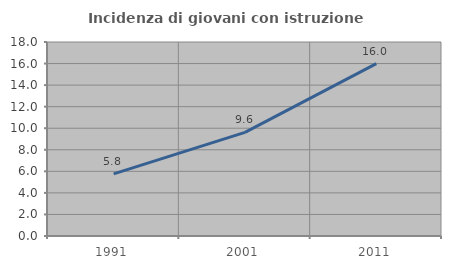
| Category | Incidenza di giovani con istruzione universitaria |
|---|---|
| 1991.0 | 5.769 |
| 2001.0 | 9.615 |
| 2011.0 | 16 |